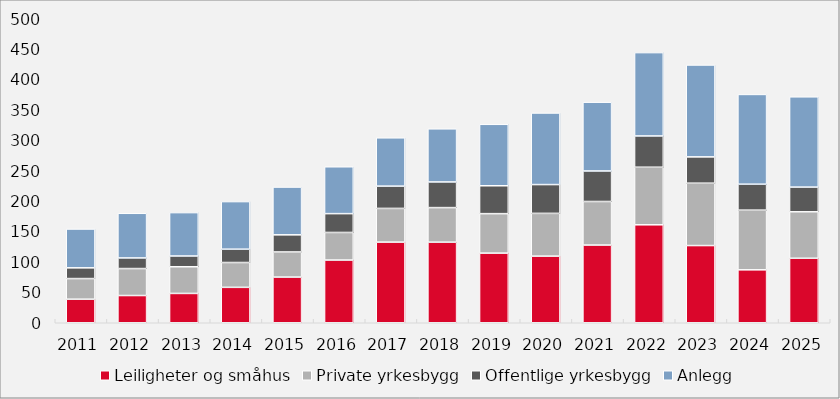
| Category | Leiligheter og småhus | Private yrkesbygg | Offentlige yrkesbygg | Anlegg |
|---|---|---|---|---|
| 2011.0 | 38.745 | 33.919 | 17.687 | 63.85 |
| 2012.0 | 44.777 | 44.354 | 17.47 | 73.444 |
| 2013.0 | 48.213 | 43.908 | 17.683 | 71.376 |
| 2014.0 | 58.248 | 40.844 | 21.916 | 78.301 |
| 2015.0 | 75.126 | 41.314 | 28.17 | 78.589 |
| 2016.0 | 103.136 | 45.359 | 30.965 | 77.108 |
| 2017.0 | 132.657 | 55.407 | 36.654 | 79.478 |
| 2018.0 | 132.554 | 56.824 | 42.217 | 87.371 |
| 2019.0 | 114.522 | 64.913 | 45.879 | 101.087 |
| 2020.0 | 109.582 | 70.336 | 47.345 | 117.77 |
| 2021.0 | 127.806 | 71.631 | 50.2 | 113.156 |
| 2022.0 | 161.117 | 94.706 | 51.419 | 137.106 |
| 2023.0 | 126.957 | 102.594 | 43.273 | 151.153 |
| 2024.0 | 87.05 | 98.169 | 42.66 | 147.647 |
| 2025.0 | 106.062 | 76.409 | 40.654 | 148.507 |